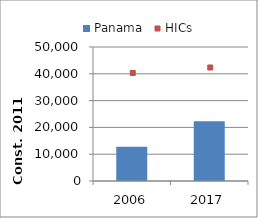
| Category | Panama |
|---|---|
| 2006.0 | 12735.557 |
| 2017.0 | 22287.959 |